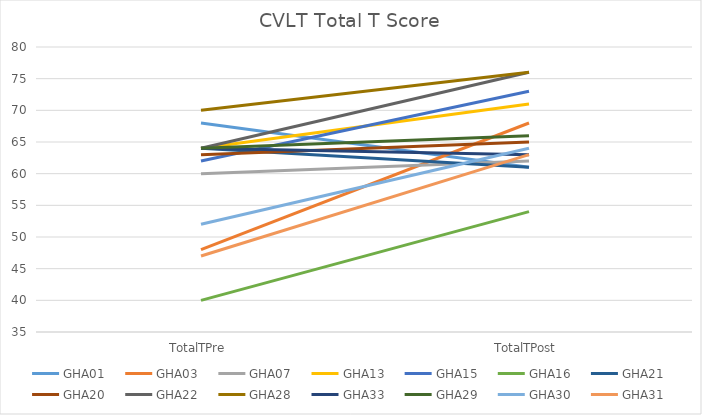
| Category | GHA01 | GHA03 | GHA07 | GHA13 | GHA15 | GHA16 | GHA21 | GHA20 | GHA22 | GHA28 | GHA33 | GHA29 | GHA30 | GHA31 |
|---|---|---|---|---|---|---|---|---|---|---|---|---|---|---|
| TotalTPre | 68 | 48 | 60 | 64 | 62 | 40 | 64 | 63 | 64 | 70 | 64 | 64 | 52 | 47 |
| TotalTPost | 61 | 68 | 62 | 71 | 73 | 54 | 61 | 65 | 76 | 76 | 63 | 66 | 64 | 63 |